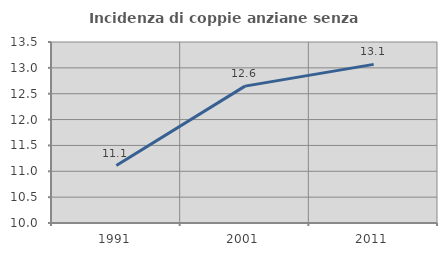
| Category | Incidenza di coppie anziane senza figli  |
|---|---|
| 1991.0 | 11.111 |
| 2001.0 | 12.647 |
| 2011.0 | 13.067 |